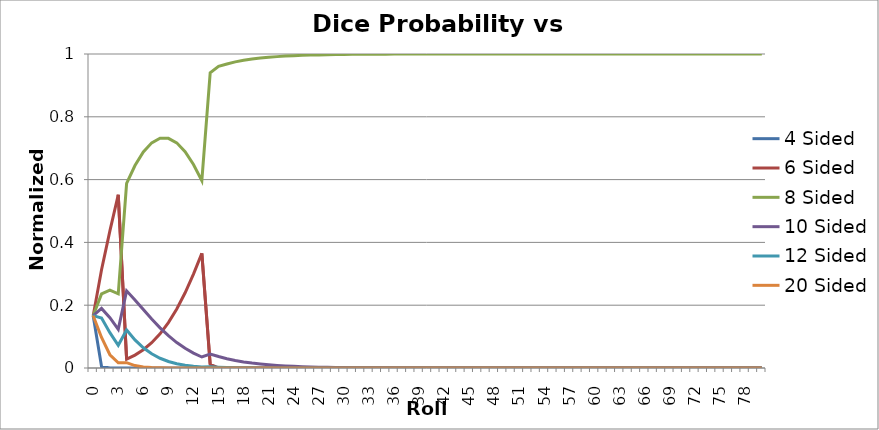
| Category | 4 Sided | 6 Sided | 8 Sided | 10 Sided | 12 Sided | 20 Sided |
|---|---|---|---|---|---|---|
| 0.0 | 0.167 | 0.167 | 0.167 | 0.167 | 0.167 | 0.167 |
| 1.0 | 0.005 | 0.313 | 0.236 | 0.19 | 0.159 | 0.097 |
| 2.0 | 0 | 0.437 | 0.248 | 0.16 | 0.113 | 0.042 |
| 3.0 | 0 | 0.552 | 0.236 | 0.123 | 0.072 | 0.017 |
| 4.0 | 0 | 0.028 | 0.588 | 0.246 | 0.121 | 0.017 |
| 5.0 | 0 | 0.041 | 0.645 | 0.217 | 0.089 | 0.008 |
| 6.0 | 0 | 0.058 | 0.688 | 0.186 | 0.064 | 0.003 |
| 7.0 | 0 | 0.081 | 0.717 | 0.156 | 0.045 | 0.001 |
| 8.0 | 0 | 0.109 | 0.732 | 0.128 | 0.031 | 0.001 |
| 9.0 | 0 | 0.145 | 0.731 | 0.103 | 0.021 | 0 |
| 10.0 | 0 | 0.188 | 0.717 | 0.081 | 0.014 | 0 |
| 11.0 | 0 | 0.24 | 0.689 | 0.063 | 0.009 | 0 |
| 12.0 | 0 | 0.299 | 0.648 | 0.047 | 0.006 | 0 |
| 13.0 | 0 | 0.365 | 0.597 | 0.035 | 0.004 | 0 |
| 14.0 | 0 | 0.012 | 0.94 | 0.044 | 0.004 | 0 |
| 15.0 | 0 | 0 | 0.961 | 0.037 | 0.003 | 0 |
| 16.0 | 0 | 0 | 0.968 | 0.03 | 0.002 | 0 |
| 17.0 | 0 | 0 | 0.975 | 0.024 | 0.001 | 0 |
| 18.0 | 0 | 0 | 0.98 | 0.019 | 0.001 | 0 |
| 19.0 | 0 | 0 | 0.984 | 0.016 | 0.001 | 0 |
| 20.0 | 0 | 0 | 0.987 | 0.013 | 0 | 0 |
| 21.0 | 0 | 0 | 0.99 | 0.01 | 0 | 0 |
| 22.0 | 0 | 0 | 0.992 | 0.008 | 0 | 0 |
| 23.0 | 0 | 0 | 0.993 | 0.007 | 0 | 0 |
| 24.0 | 0 | 0 | 0.995 | 0.005 | 0 | 0 |
| 25.0 | 0 | 0 | 0.996 | 0.004 | 0 | 0 |
| 26.0 | 0 | 0 | 0.997 | 0.003 | 0 | 0 |
| 27.0 | 0 | 0 | 0.997 | 0.003 | 0 | 0 |
| 28.0 | 0 | 0 | 0.998 | 0.002 | 0 | 0 |
| 29.0 | 0 | 0 | 0.998 | 0.002 | 0 | 0 |
| 30.0 | 0 | 0 | 0.999 | 0.001 | 0 | 0 |
| 31.0 | 0 | 0 | 0.999 | 0.001 | 0 | 0 |
| 32.0 | 0 | 0 | 0.999 | 0.001 | 0 | 0 |
| 33.0 | 0 | 0 | 0.999 | 0.001 | 0 | 0 |
| 34.0 | 0 | 0 | 0.999 | 0.001 | 0 | 0 |
| 35.0 | 0 | 0 | 1 | 0 | 0 | 0 |
| 36.0 | 0 | 0 | 1 | 0 | 0 | 0 |
| 37.0 | 0 | 0 | 1 | 0 | 0 | 0 |
| 38.0 | 0 | 0 | 1 | 0 | 0 | 0 |
| 39.0 | 0 | 0 | 1 | 0 | 0 | 0 |
| 40.0 | 0 | 0 | 1 | 0 | 0 | 0 |
| 41.0 | 0 | 0 | 1 | 0 | 0 | 0 |
| 42.0 | 0 | 0 | 1 | 0 | 0 | 0 |
| 43.0 | 0 | 0 | 1 | 0 | 0 | 0 |
| 44.0 | 0 | 0 | 1 | 0 | 0 | 0 |
| 45.0 | 0 | 0 | 1 | 0 | 0 | 0 |
| 46.0 | 0 | 0 | 1 | 0 | 0 | 0 |
| 47.0 | 0 | 0 | 1 | 0 | 0 | 0 |
| 48.0 | 0 | 0 | 1 | 0 | 0 | 0 |
| 49.0 | 0 | 0 | 1 | 0 | 0 | 0 |
| 50.0 | 0 | 0 | 1 | 0 | 0 | 0 |
| 51.0 | 0 | 0 | 1 | 0 | 0 | 0 |
| 52.0 | 0 | 0 | 1 | 0 | 0 | 0 |
| 53.0 | 0 | 0 | 1 | 0 | 0 | 0 |
| 54.0 | 0 | 0 | 1 | 0 | 0 | 0 |
| 55.0 | 0 | 0 | 1 | 0 | 0 | 0 |
| 56.0 | 0 | 0 | 1 | 0 | 0 | 0 |
| 57.0 | 0 | 0 | 1 | 0 | 0 | 0 |
| 58.0 | 0 | 0 | 1 | 0 | 0 | 0 |
| 59.0 | 0 | 0 | 1 | 0 | 0 | 0 |
| 60.0 | 0 | 0 | 1 | 0 | 0 | 0 |
| 61.0 | 0 | 0 | 1 | 0 | 0 | 0 |
| 62.0 | 0 | 0 | 1 | 0 | 0 | 0 |
| 63.0 | 0 | 0 | 1 | 0 | 0 | 0 |
| 64.0 | 0 | 0 | 1 | 0 | 0 | 0 |
| 65.0 | 0 | 0 | 1 | 0 | 0 | 0 |
| 66.0 | 0 | 0 | 1 | 0 | 0 | 0 |
| 67.0 | 0 | 0 | 1 | 0 | 0 | 0 |
| 68.0 | 0 | 0 | 1 | 0 | 0 | 0 |
| 69.0 | 0 | 0 | 1 | 0 | 0 | 0 |
| 70.0 | 0 | 0 | 1 | 0 | 0 | 0 |
| 71.0 | 0 | 0 | 1 | 0 | 0 | 0 |
| 72.0 | 0 | 0 | 1 | 0 | 0 | 0 |
| 73.0 | 0 | 0 | 1 | 0 | 0 | 0 |
| 74.0 | 0 | 0 | 1 | 0 | 0 | 0 |
| 75.0 | 0 | 0 | 1 | 0 | 0 | 0 |
| 76.0 | 0 | 0 | 1 | 0 | 0 | 0 |
| 77.0 | 0 | 0 | 1 | 0 | 0 | 0 |
| 78.0 | 0 | 0 | 1 | 0 | 0 | 0 |
| 79.0 | 0 | 0 | 1 | 0 | 0 | 0 |
| 80.0 | 0 | 0 | 1 | 0 | 0 | 0 |